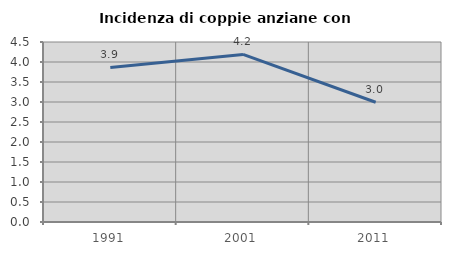
| Category | Incidenza di coppie anziane con figli |
|---|---|
| 1991.0 | 3.865 |
| 2001.0 | 4.188 |
| 2011.0 | 2.994 |